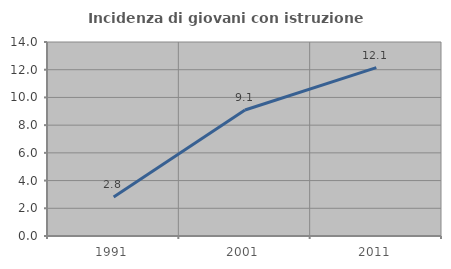
| Category | Incidenza di giovani con istruzione universitaria |
|---|---|
| 1991.0 | 2.817 |
| 2001.0 | 9.091 |
| 2011.0 | 12.15 |